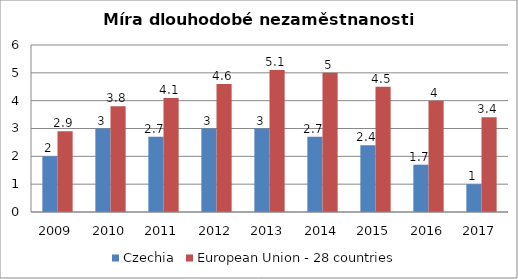
| Category | Czechia | European Union - 28 countries |
|---|---|---|
| 2009 | 2 | 2.9 |
| 2010 | 3 | 3.8 |
| 2011 | 2.7 | 4.1 |
| 2012 | 3 | 4.6 |
| 2013 | 3 | 5.1 |
| 2014 | 2.7 | 5 |
| 2015 | 2.4 | 4.5 |
| 2016 | 1.7 | 4 |
| 2017 | 1 | 3.4 |